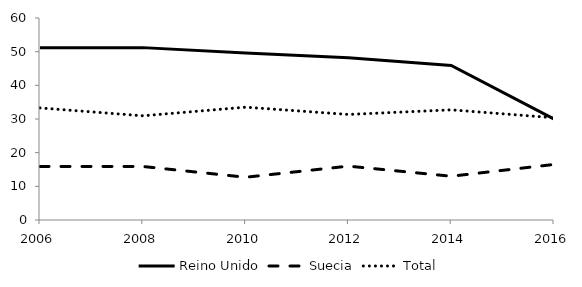
| Category | Reino Unido | Suecia | Total |
|---|---|---|---|
| 2006.0 | 51.2 | 15.9 | 33.29 |
| 2008.0 | 51.2 | 15.9 | 30.95 |
| 2010.0 | 49.6 | 12.7 | 33.51 |
| 2012.0 | 48.2 | 16 | 31.35 |
| 2014.0 | 45.9 | 13 | 32.72 |
| 2016.0 | 30 | 16.5 | 30.37 |